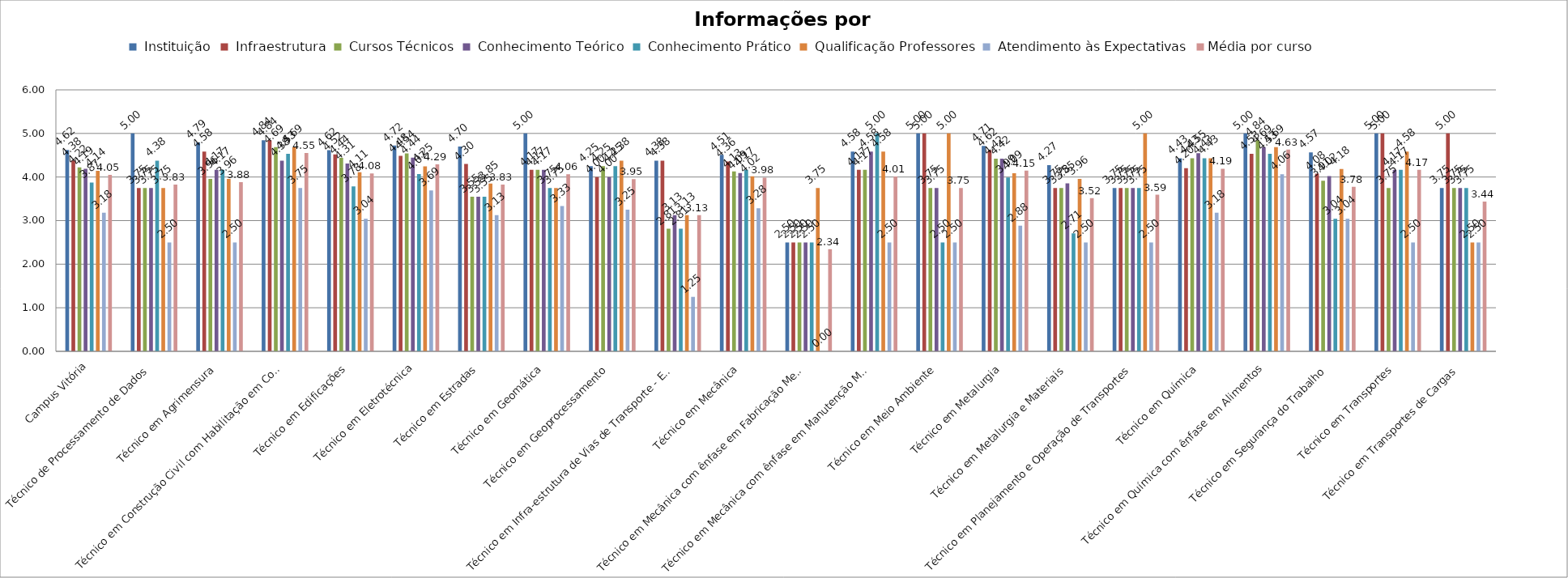
| Category |  Instituição |  Infraestrutura |  Cursos Técnicos |  Conhecimento Teórico |  Conhecimento Prático |  Qualificação Professores |  Atendimento às Expectativas | Média por curso |
|---|---|---|---|---|---|---|---|---|
| Campus Vitória | 4.62 | 4.377 | 4.22 | 4.189 | 3.874 | 4.145 | 3.181 | 4.049 |
| Técnico de Processamento de Dados | 5 | 3.75 | 3.75 | 3.75 | 4.375 | 3.75 | 2.5 | 3.828 |
| Técnico em Agrimensura | 4.792 | 4.583 | 3.958 | 4.167 | 4.167 | 3.958 | 2.5 | 3.88 |
| Técnico em Construção Civil com Habilitação em Construção de Edifícios | 4.844 | 4.844 | 4.688 | 4.375 | 4.531 | 4.688 | 3.75 | 4.551 |
| Técnico em Edificações | 4.615 | 4.519 | 4.441 | 4.309 | 3.783 | 4.112 | 3.041 | 4.084 |
| Técnico em Eletrotécnica | 4.722 | 4.484 | 4.544 | 4.444 | 4.067 | 4.246 | 3.69 | 4.291 |
| Técnico em Estradas | 4.7 | 4.3 | 3.55 | 3.55 | 3.55 | 3.85 | 3.125 | 3.828 |
| Técnico em Geomática | 5 | 4.167 | 4.167 | 4.167 | 3.75 | 3.75 | 3.333 | 4.062 |
| Técnico em Geoprocessamento | 4.25 | 4 | 4.25 | 4 | 4.25 | 4.375 | 3.25 | 3.953 |
| Técnico em Infra-estrutura de Vias de Transporte - Estradas | 4.375 | 4.375 | 2.812 | 3.125 | 2.812 | 3.125 | 1.25 | 3.125 |
| Técnico em Mecânica | 4.508 | 4.356 | 4.129 | 4.091 | 4.167 | 4.015 | 3.281 | 3.985 |
| Técnico em Mecânica com ênfase em Fabricação Mecânica | 2.5 | 2.5 | 2.5 | 2.5 | 2.5 | 3.75 | 0 | 2.344 |
| Técnico em Mecânica com ênfase em Manutenção Mecânica | 4.583 | 4.167 | 4.167 | 4.583 | 5 | 4.583 | 2.5 | 4.01 |
| Técnico em Meio Ambiente | 5 | 5 | 3.75 | 3.75 | 2.5 | 5 | 2.5 | 3.75 |
| Técnico em Metalurgia | 4.712 | 4.615 | 4.423 | 4.423 | 3.99 | 4.087 | 2.885 | 4.147 |
| Técnico em Metalurgia e Materiais | 4.271 | 3.75 | 3.75 | 3.854 | 2.708 | 3.958 | 2.5 | 3.516 |
| Técnico em Planejamento e Operação de Transportes | 3.75 | 3.75 | 3.75 | 3.75 | 3.75 | 5 | 2.5 | 3.594 |
| Técnico em Química | 4.432 | 4.205 | 4.432 | 4.545 | 4.432 | 4.432 | 3.182 | 4.19 |
| Técnico em Química com ênfase em Alimentos | 5 | 4.531 | 4.844 | 4.688 | 4.531 | 4.688 | 4.062 | 4.629 |
| Técnico em Segurança do Trabalho | 4.565 | 4.076 | 3.913 | 4.022 | 3.043 | 4.185 | 3.043 | 3.777 |
| Técnico em Transportes | 5 | 5 | 3.75 | 4.167 | 4.167 | 4.583 | 2.5 | 4.167 |
| Técnico em Transportes de Cargas | 3.75 | 5 | 3.75 | 3.75 | 3.75 | 2.5 | 2.5 | 3.438 |